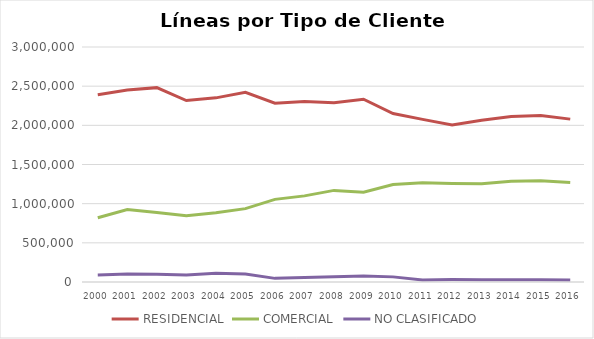
| Category | RESIDENCIAL | COMERCIAL | NO CLASIFICADO |
|---|---|---|---|
| 2000.0 | 2391600.86 | 820134.14 | 90763 |
| 2001.0 | 2450631.958 | 924449.042 | 103411 |
| 2002.0 | 2481214 | 887657 | 98142 |
| 2003.0 | 2315980 | 846524 | 89559 |
| 2004.0 | 2350770.912 | 882812.088 | 111519 |
| 2005.0 | 2420710.597 | 936558.403 | 103376 |
| 2006.0 | 2282170 | 1055019 | 46408 |
| 2007.0 | 2304237 | 1099345 | 56029 |
| 2008.0 | 2289075 | 1169557 | 66158 |
| 2009.0 | 2332952 | 1145936 | 76423 |
| 2010.0 | 2149852 | 1244093 | 65422 |
| 2011.0 | 2076184 | 1267963 | 25957 |
| 2012.0 | 2003235 | 1257853 | 31414 |
| 2013.0 | 2064536 | 1252954 | 29741 |
| 2014.0 | 2113422 | 1284776 | 29551 |
| 2015.0 | 2126562 | 1291291 | 28027 |
| 2016.0 | 2079358 | 1270087 | 25592 |